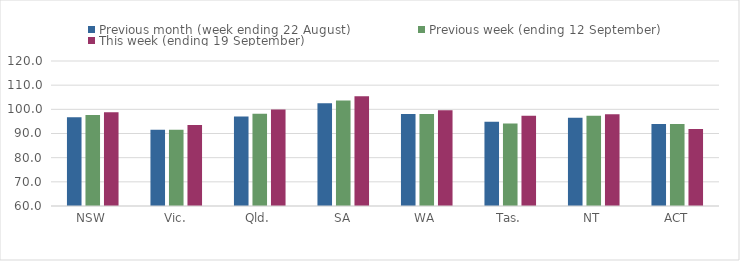
| Category | Previous month (week ending 22 August) | Previous week (ending 12 September) | This week (ending 19 September) |
|---|---|---|---|
| NSW | 96.71 | 97.7 | 98.81 |
| Vic. | 91.54 | 91.53 | 93.47 |
| Qld. | 97.03 | 98.18 | 99.97 |
| SA | 102.51 | 103.64 | 105.43 |
| WA | 98.09 | 98.05 | 99.62 |
| Tas. | 94.91 | 94.16 | 97.34 |
| NT | 96.54 | 97.37 | 97.94 |
| ACT | 93.96 | 93.96 | 91.88 |